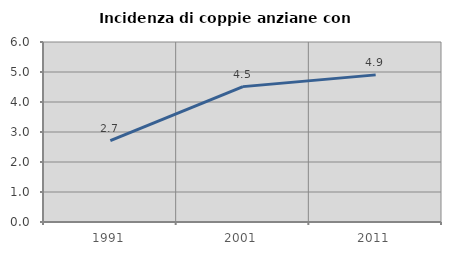
| Category | Incidenza di coppie anziane con figli |
|---|---|
| 1991.0 | 2.713 |
| 2001.0 | 4.512 |
| 2011.0 | 4.904 |